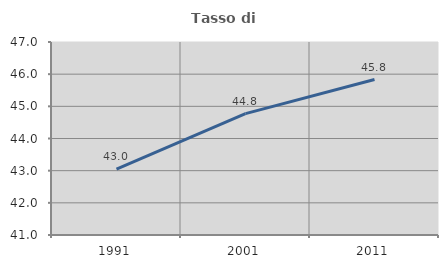
| Category | Tasso di occupazione   |
|---|---|
| 1991.0 | 43.046 |
| 2001.0 | 44.772 |
| 2011.0 | 45.833 |